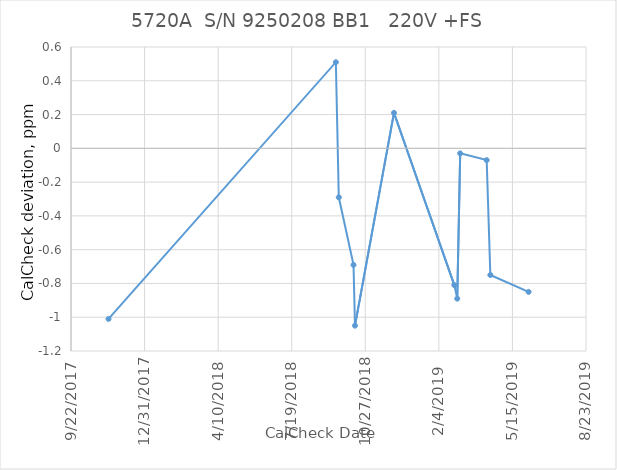
| Category |   220V +FS |
|---|---|
| 43051.0 | -1.01 |
| 43360.0 | 0.51 |
| 43364.0 | -0.29 |
| 43384.0 | -0.69 |
| 43386.0 | -1.05 |
| 43439.0 | 0.21 |
| 43521.0 | -0.81 |
| 43525.0 | -0.89 |
| 43529.0 | -0.03 |
| 43565.0 | -0.07 |
| 43570.0 | -0.75 |
| 43622.0 | -0.85 |